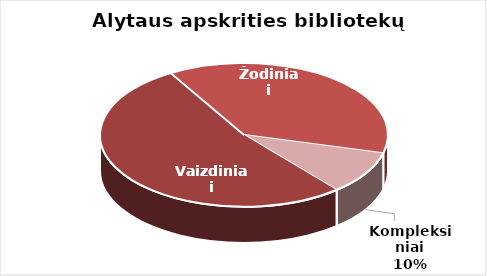
| Category | Series 0 |
|---|---|
| Vaizdiniai | 1469 |
| Žodiniai | 1051 |
| Kompleksiniai | 273 |